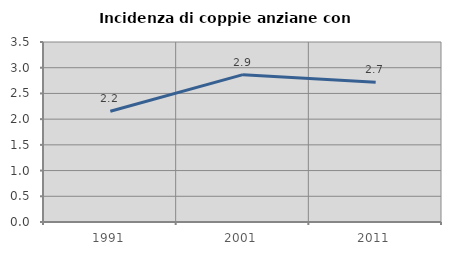
| Category | Incidenza di coppie anziane con figli |
|---|---|
| 1991.0 | 2.153 |
| 2001.0 | 2.865 |
| 2011.0 | 2.719 |